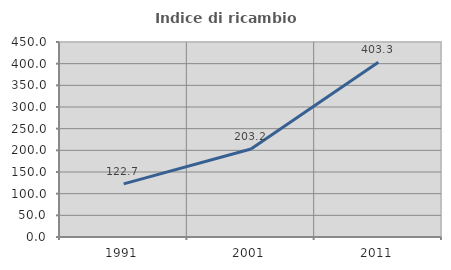
| Category | Indice di ricambio occupazionale  |
|---|---|
| 1991.0 | 122.689 |
| 2001.0 | 203.185 |
| 2011.0 | 403.306 |